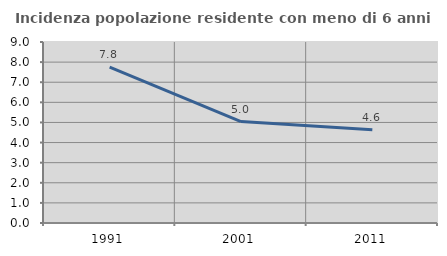
| Category | Incidenza popolazione residente con meno di 6 anni |
|---|---|
| 1991.0 | 7.755 |
| 2001.0 | 5.044 |
| 2011.0 | 4.631 |